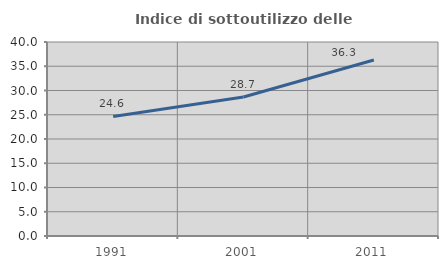
| Category | Indice di sottoutilizzo delle abitazioni  |
|---|---|
| 1991.0 | 24.639 |
| 2001.0 | 28.651 |
| 2011.0 | 36.293 |